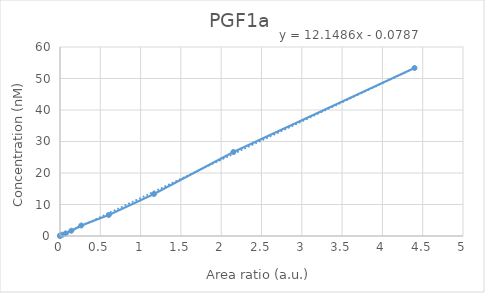
| Category | Series 0 |
|---|---|
| 0.0 | 0 |
| 0.000967150050528737 | 0.208 |
| 0.0297106725882002 | 0.417 |
| 0.0712467531008255 | 0.833 |
| 0.139965762810033 | 1.667 |
| 0.263696696084891 | 3.333 |
| 0.60548235706348 | 6.667 |
| 1.16611507809936 | 13.333 |
| 2.15185351244502 | 26.667 |
| 4.39874814236043 | 53.333 |